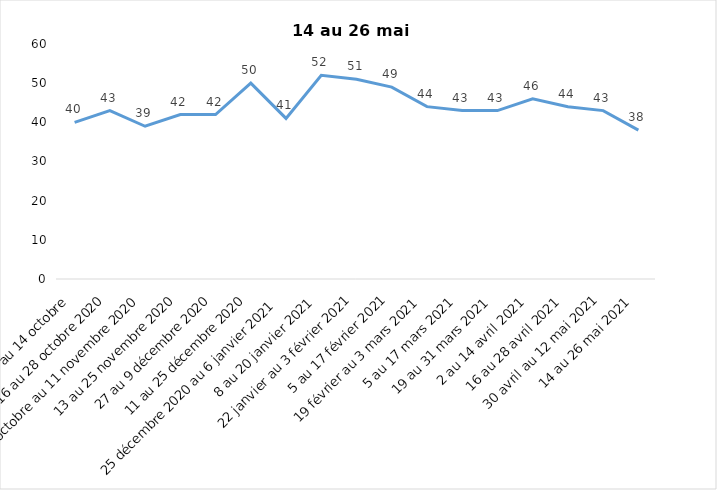
| Category | Toujours aux trois mesures |
|---|---|
| 2 au 14 octobre  | 40 |
| 16 au 28 octobre 2020 | 43 |
| 30 octobre au 11 novembre 2020 | 39 |
| 13 au 25 novembre 2020 | 42 |
| 27 au 9 décembre 2020 | 42 |
| 11 au 25 décembre 2020 | 50 |
| 25 décembre 2020 au 6 janvier 2021 | 41 |
| 8 au 20 janvier 2021 | 52 |
| 22 janvier au 3 février 2021 | 51 |
| 5 au 17 février 2021 | 49 |
| 19 février au 3 mars 2021 | 44 |
| 5 au 17 mars 2021 | 43 |
| 19 au 31 mars 2021 | 43 |
| 2 au 14 avril 2021 | 46 |
| 16 au 28 avril 2021 | 44 |
| 30 avril au 12 mai 2021 | 43 |
| 14 au 26 mai 2021 | 38 |